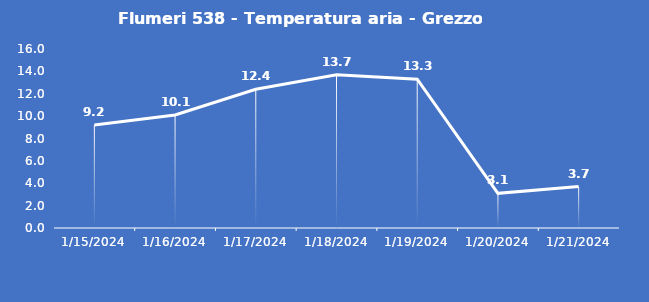
| Category | Flumeri 538 - Temperatura aria - Grezzo (°C) |
|---|---|
| 1/15/24 | 9.2 |
| 1/16/24 | 10.1 |
| 1/17/24 | 12.4 |
| 1/18/24 | 13.7 |
| 1/19/24 | 13.3 |
| 1/20/24 | 3.1 |
| 1/21/24 | 3.7 |